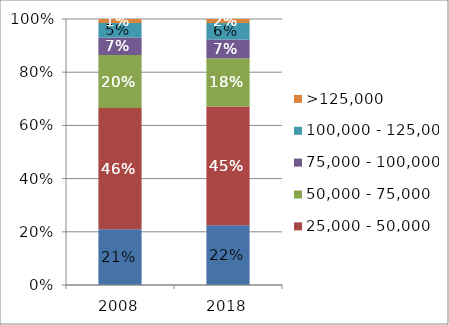
| Category | <25,000 | 25,000 - 50,000 | 50,000 - 75,000 | 75,000 - 100,000 | 100,000 - 125,000 | >125,000 |
|---|---|---|---|---|---|---|
| 2008.0 | 0.21 | 0.456 | 0.199 | 0.067 | 0.054 | 0.015 |
| 2018.0 | 0.224 | 0.447 | 0.182 | 0.07 | 0.062 | 0.015 |